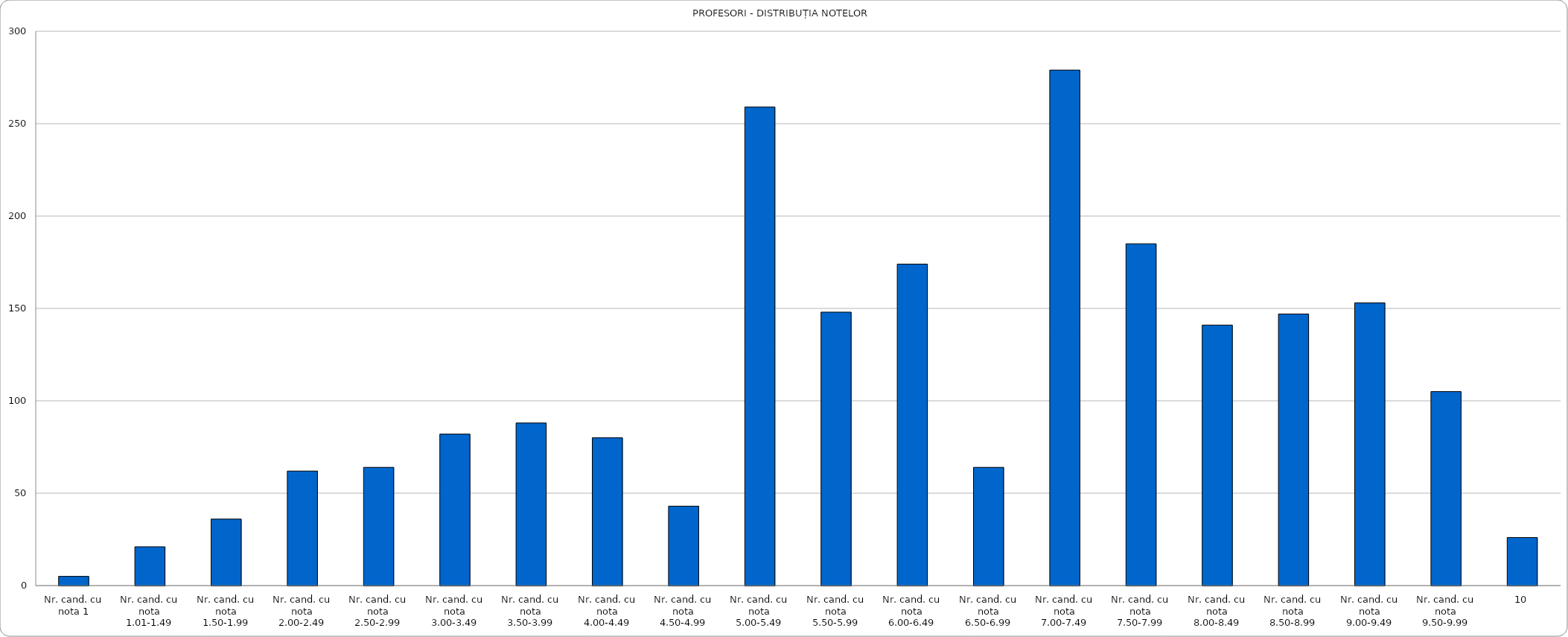
| Category | Series 0 |
|---|---|
| Nr. cand. cu nota 1 | 5 |
| Nr. cand. cu nota 1.01-1.49 | 21 |
| Nr. cand. cu nota 1.50-1.99 | 36 |
| Nr. cand. cu nota 2.00-2.49 | 62 |
| Nr. cand. cu nota 2.50-2.99 | 64 |
| Nr. cand. cu nota 3.00-3.49 | 82 |
| Nr. cand. cu nota 3.50-3.99 | 88 |
| Nr. cand. cu nota 4.00-4.49 | 80 |
| Nr. cand. cu nota 4.50-4.99 | 43 |
| Nr. cand. cu nota 5.00-5.49 | 259 |
| Nr. cand. cu nota 5.50-5.99 | 148 |
| Nr. cand. cu nota 6.00-6.49 | 174 |
| Nr. cand. cu nota 6.50-6.99 | 64 |
| Nr. cand. cu nota 7.00-7.49 | 279 |
| Nr. cand. cu nota 7.50-7.99 | 185 |
| Nr. cand. cu nota 8.00-8.49 | 141 |
| Nr. cand. cu nota 8.50-8.99 | 147 |
| Nr. cand. cu nota 9.00-9.49 | 153 |
| Nr. cand. cu nota 9.50-9.99 | 105 |
| 10 | 26 |